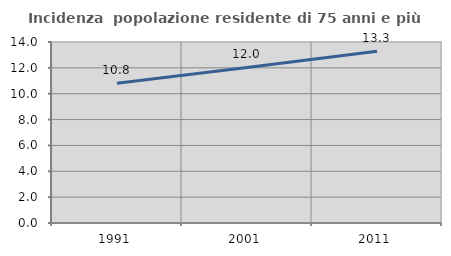
| Category | Incidenza  popolazione residente di 75 anni e più |
|---|---|
| 1991.0 | 10.811 |
| 2001.0 | 12.033 |
| 2011.0 | 13.277 |